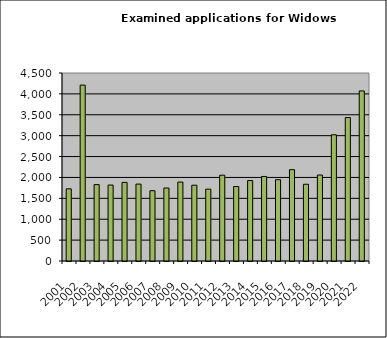
| Category | Series 0 |
|---|---|
| 2001.0 | 1727 |
| 2002.0 | 4210 |
| 2003.0 | 1829 |
| 2004.0 | 1818 |
| 2005.0 | 1881 |
| 2006.0 | 1841 |
| 2007.0 | 1682 |
| 2008.0 | 1747 |
| 2009.0 | 1889 |
| 2010.0 | 1814 |
| 2011.0 | 1720 |
| 2012.0 | 2054 |
| 2013.0 | 1782 |
| 2014.0 | 1926 |
| 2015.0 | 2023 |
| 2016.0 | 1946 |
| 2017.0 | 2186 |
| 2018.0 | 1837 |
| 2019.0 | 2058 |
| 2020.0 | 3021 |
| 2021.0 | 3433 |
| 2022.0 | 4071 |